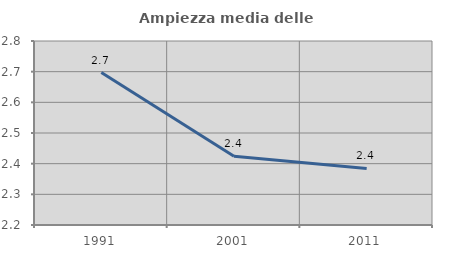
| Category | Ampiezza media delle famiglie |
|---|---|
| 1991.0 | 2.697 |
| 2001.0 | 2.424 |
| 2011.0 | 2.384 |